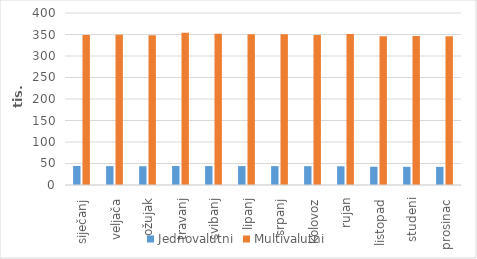
| Category | Jednovalutni | Multivalutni |
|---|---|---|
| siječanj | 44241 | 349106 |
| veljača | 43870 | 349147 |
| ožujak | 43629 | 348210 |
| travanj | 44169 | 353872 |
| svibanj | 44058 | 351572 |
| lipanj | 43992 | 350768 |
| srpanj | 43823 | 350363 |
| kolovoz | 43681 | 348650 |
| rujan | 43512 | 350979 |
| listopad | 42481 | 345995 |
| studeni | 42373 | 346488 |
| prosinac | 42221 | 345914 |